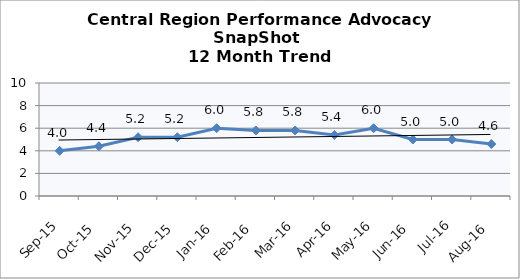
| Category | Central Region |
|---|---|
| Sep-15 | 4 |
| Oct-15 | 4.4 |
| Nov-15 | 5.2 |
| Dec-15 | 5.2 |
| Jan-16 | 6 |
| Feb-16 | 5.8 |
| Mar-16 | 5.8 |
| Apr-16 | 5.4 |
| May-16 | 6 |
| Jun-16 | 5 |
| Jul-16 | 5 |
| Aug-16 | 4.6 |